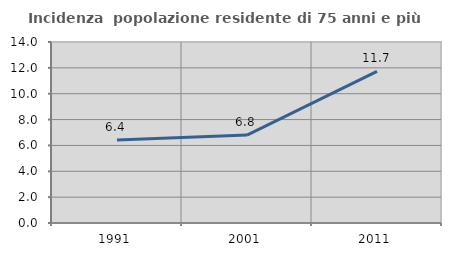
| Category | Incidenza  popolazione residente di 75 anni e più |
|---|---|
| 1991.0 | 6.425 |
| 2001.0 | 6.798 |
| 2011.0 | 11.73 |